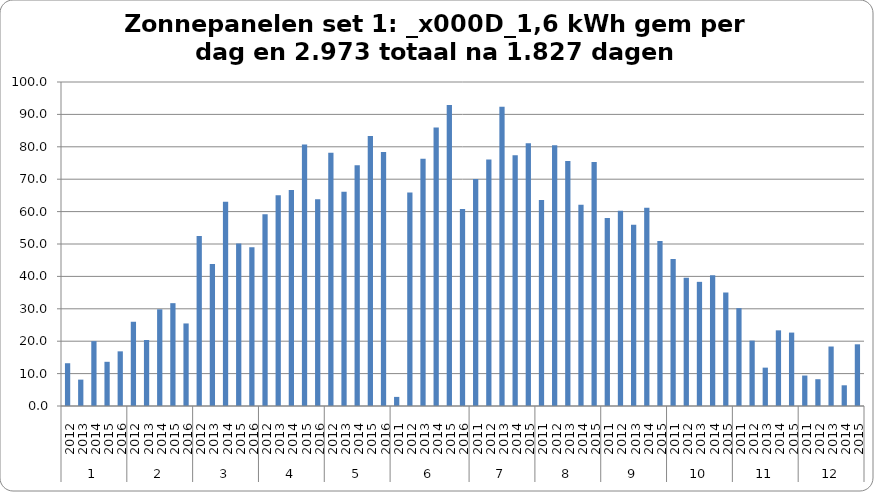
| Category | Totaal |
|---|---|
| 0 | 13.2 |
| 1 | 8.14 |
| 2 | 20.02 |
| 3 | 13.64 |
| 4 | 16.87 |
| 5 | 26 |
| 6 | 20.38 |
| 7 | 29.844 |
| 8 | 31.74 |
| 9 | 25.48 |
| 10 | 52.5 |
| 11 | 43.84 |
| 12 | 63.07 |
| 13 | 50.17 |
| 14 | 49.03 |
| 15 | 59.2 |
| 16 | 65.01 |
| 17 | 66.64 |
| 18 | 80.71 |
| 19 | 63.83 |
| 20 | 78.2 |
| 21 | 66.1 |
| 22 | 74.28 |
| 23 | 83.35 |
| 24 | 78.38 |
| 25 | 2.81 |
| 26 | 65.9 |
| 27 | 76.34 |
| 28 | 85.97 |
| 29 | 92.89 |
| 30 | 60.84 |
| 31 | 70.026 |
| 32 | 76.053 |
| 33 | 92.37 |
| 34 | 77.4 |
| 35 | 81.13 |
| 36 | 63.564 |
| 37 | 80.447 |
| 38 | 75.63 |
| 39 | 62.13 |
| 40 | 75.31 |
| 41 | 58 |
| 42 | 60.3 |
| 43 | 55.97 |
| 44 | 61.18 |
| 45 | 50.908 |
| 46 | 45.4 |
| 47 | 39.61 |
| 48 | 38.32 |
| 49 | 40.32 |
| 50 | 35.03 |
| 51 | 30.2 |
| 52 | 20.19 |
| 53 | 11.84 |
| 54 | 23.35 |
| 55 | 22.66 |
| 56 | 9.4 |
| 57 | 8.27 |
| 58 | 18.36 |
| 59 | 6.39 |
| 60 | 19.04 |